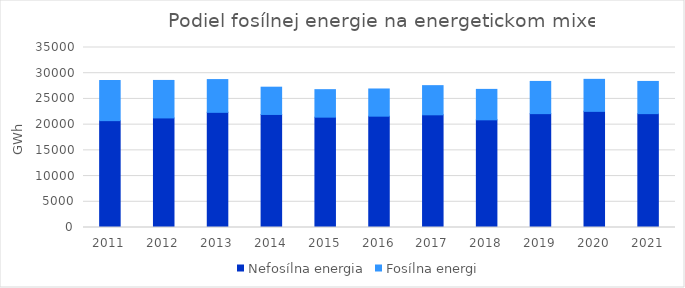
| Category | Nefosílna energia | Fosílna energia |
|---|---|---|
| 2011 | 20778.187 | 7800 |
| 2012 | 21305 | 7290 |
| 2013 | 22391 | 6372 |
| 2014 | 21981 | 5302 |
| 2015 | 21457 | 5346 |
| 2016 | 21650 | 5284 |
| 2017 | 21912 | 5671 |
| 2018 | 20938 | 5917 |
| 2019 | 22141 | 6260 |
| 2020 | 22583 | 6224 |
| 2021 | 22141 | 6260 |